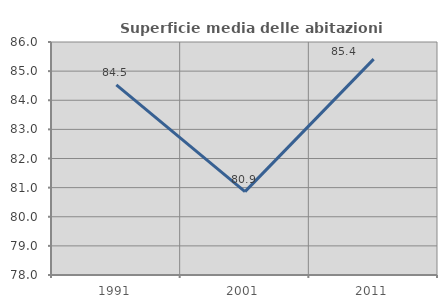
| Category | Superficie media delle abitazioni occupate |
|---|---|
| 1991.0 | 84.53 |
| 2001.0 | 80.864 |
| 2011.0 | 85.411 |